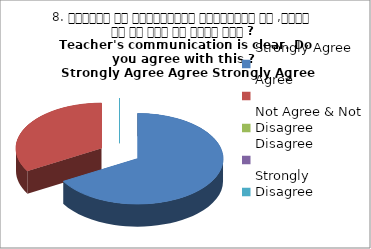
| Category | 8. शिक्षक का सम्प्रेषण सुस्पष्ठ है ,क्या आप इस बात से सहमत हैं ?
Teacher's communication is clear. Do you agree with this ? 
 Strongly Agree Agree Strongly Agree |
|---|---|
| Strongly Agree | 2 |
| Agree | 1 |
| Not Agree & Not Disagree | 0 |
| Disagree | 0 |
| Strongly Disagree | 0 |